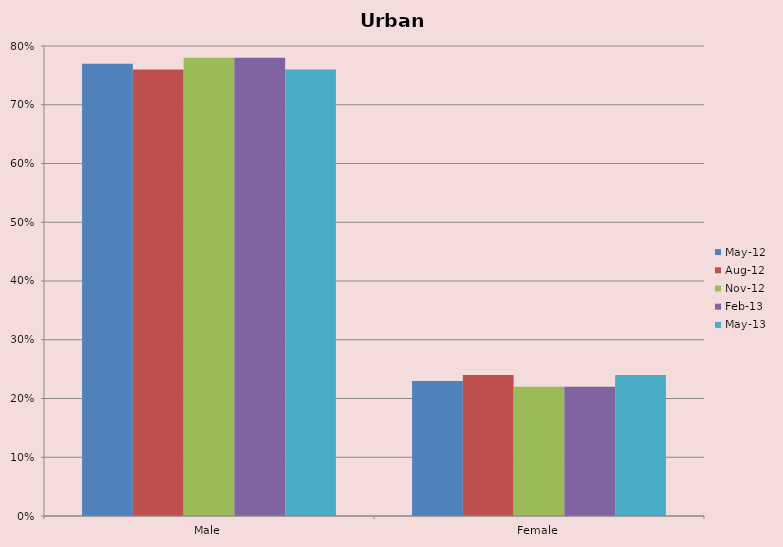
| Category | May-12 | Aug-12 | Nov-12 | Feb-13 | May-13 |
|---|---|---|---|---|---|
| Male | 0.77 | 0.76 | 0.78 | 0.78 | 0.76 |
| Female | 0.23 | 0.24 | 0.22 | 0.22 | 0.24 |